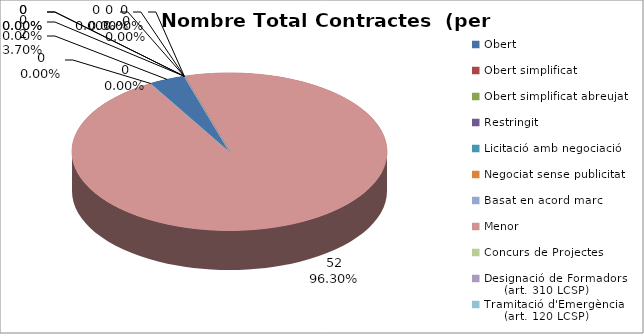
| Category | Nombre Total Contractes |
|---|---|
| Obert | 2 |
| Obert simplificat | 0 |
| Obert simplificat abreujat | 0 |
| Restringit | 0 |
| Licitació amb negociació | 0 |
| Negociat sense publicitat | 0 |
| Basat en acord marc | 0 |
| Menor | 52 |
| Concurs de Projectes | 0 |
| Designació de Formadors
     (art. 310 LCSP) | 0 |
| Tramitació d'Emergència
     (art. 120 LCSP) | 0 |